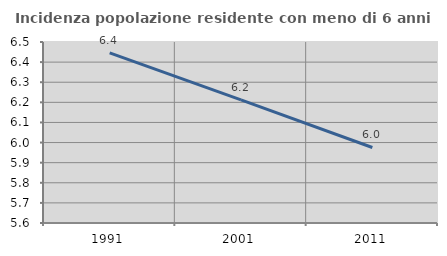
| Category | Incidenza popolazione residente con meno di 6 anni |
|---|---|
| 1991.0 | 6.446 |
| 2001.0 | 6.213 |
| 2011.0 | 5.975 |